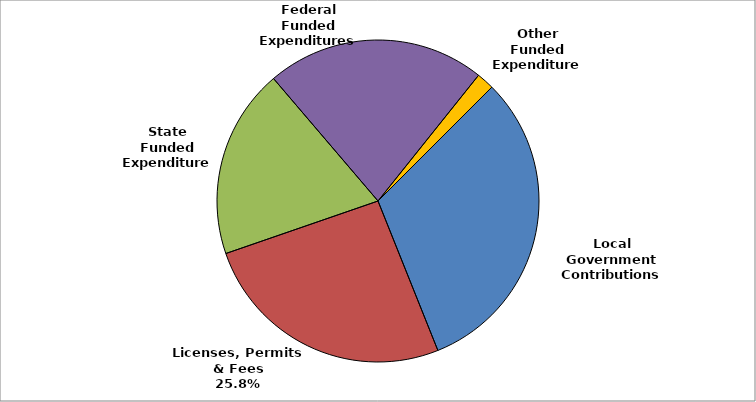
| Category | Series 0 |
|---|---|
| Local Government Contributions | 0.314 |
| Licenses, Permits & Fees | 0.258 |
| State Funded Expenditures | 0.19 |
| Federal Funded Expenditures | 0.22 |
| Other Funded Expenditures | 0.018 |